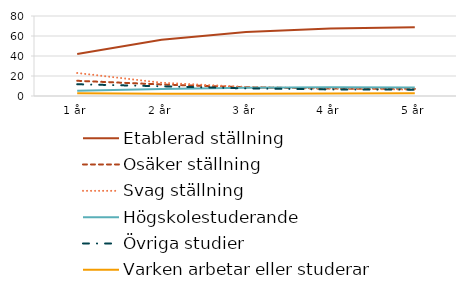
| Category | Etablerad ställning | Osäker ställning | Svag ställning | Högskolestuderande | Övriga studier | Varken arbetar eller studerar |
|---|---|---|---|---|---|---|
| 1 år | 41.93 | 15.22 | 23.02 | 5.25 | 11.75 | 2.82 |
| 2 år | 56.3 | 11.54 | 13.24 | 6.88 | 9.72 | 2.32 |
| 3 år | 64.02 | 8.71 | 9.08 | 8.32 | 7.6 | 2.27 |
| 4 år | 67.55 | 7.41 | 7.36 | 8.68 | 6.55 | 2.45 |
| 5 år | 68.81 | 7.12 | 6.41 | 8.59 | 6.35 | 2.71 |